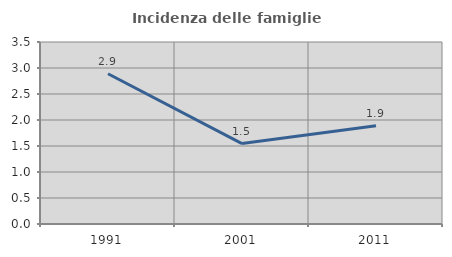
| Category | Incidenza delle famiglie numerose |
|---|---|
| 1991.0 | 2.889 |
| 2001.0 | 1.547 |
| 2011.0 | 1.889 |